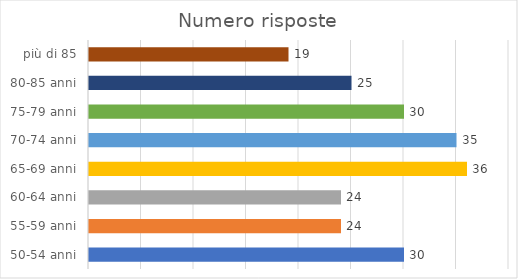
| Category | Numero risposte |
|---|---|
| 50-54 anni | 30 |
| 55-59 anni | 24 |
| 60-64 anni | 24 |
| 65-69 anni | 36 |
| 70-74 anni | 35 |
| 75-79 anni | 30 |
| 80-85 anni | 25 |
| più di 85 | 19 |